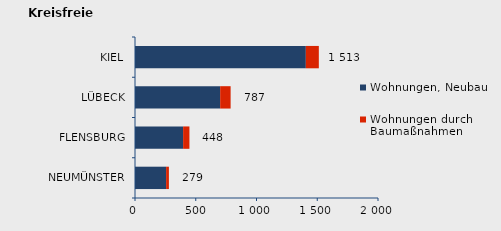
| Category | Wohnungen, Neubau | Wohnungen durch Baumaßnahmen | Series 2 |
|---|---|---|---|
| NEUMÜNSTER | 256 | 23 | 279 |
| FLENSBURG | 396 | 52 | 448 |
| LÜBECK | 701 | 86 | 787 |
| KIEL | 1406 | 107 | 1513 |